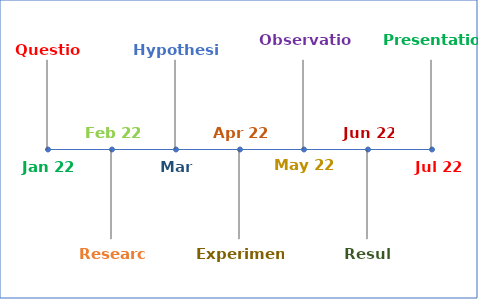
| Category | Series 1 |
|---|---|
| 0 | 1 |
| 1 | -1 |
| 2 | 1 |
| 3 | -1 |
| 4 | 1 |
| 5 | -1 |
| 6 | 1 |